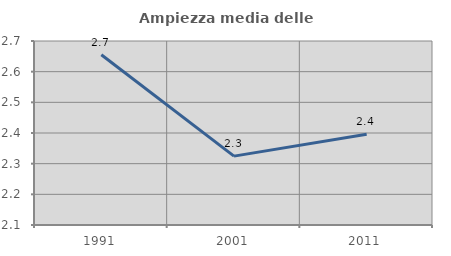
| Category | Ampiezza media delle famiglie |
|---|---|
| 1991.0 | 2.655 |
| 2001.0 | 2.325 |
| 2011.0 | 2.396 |